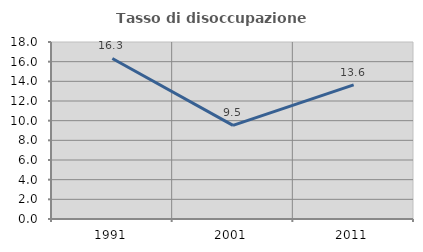
| Category | Tasso di disoccupazione giovanile  |
|---|---|
| 1991.0 | 16.327 |
| 2001.0 | 9.524 |
| 2011.0 | 13.636 |